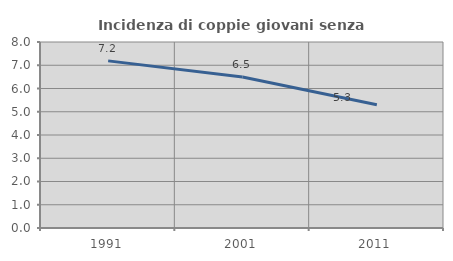
| Category | Incidenza di coppie giovani senza figli |
|---|---|
| 1991.0 | 7.188 |
| 2001.0 | 6.496 |
| 2011.0 | 5.298 |